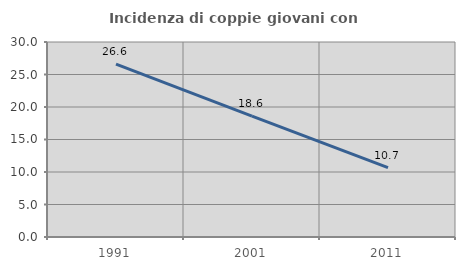
| Category | Incidenza di coppie giovani con figli |
|---|---|
| 1991.0 | 26.589 |
| 2001.0 | 18.589 |
| 2011.0 | 10.679 |